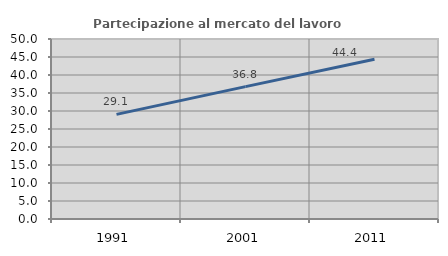
| Category | Partecipazione al mercato del lavoro  femminile |
|---|---|
| 1991.0 | 29.056 |
| 2001.0 | 36.772 |
| 2011.0 | 44.388 |